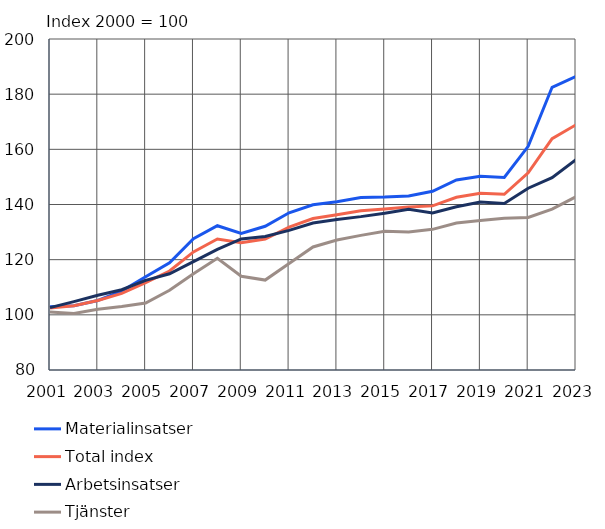
| Category | Materialinsatser | Total index | Arbetsinsatser | Tjänster |
|---|---|---|---|---|
| 2001.0 | 102.9 | 102.5 | 102.6 | 101 |
| 2002.0 | 103.3 | 103.3 | 104.8 | 100.5 |
| 2003.0 | 105.2 | 105.2 | 107.1 | 102 |
| 2004.0 | 108.6 | 107.8 | 109.1 | 103 |
| 2005.0 | 113.8 | 111.7 | 112.5 | 104.3 |
| 2006.0 | 118.9 | 115.9 | 114.9 | 108.9 |
| 2007.0 | 127.6 | 122.8 | 119.3 | 114.9 |
| 2008.0 | 132.3 | 127.5 | 123.7 | 120.5 |
| 2009.0 | 129.5 | 126.1 | 127.5 | 114 |
| 2010.0 | 132.1 | 127.5 | 128.4 | 112.6 |
| 2011.0 | 137 | 131.8 | 130.6 | 118.6 |
| 2012.0 | 139.9 | 134.9 | 133.3 | 124.6 |
| 2013.0 | 141 | 136.3 | 134.6 | 127.1 |
| 2014.0 | 142.5 | 137.7 | 135.6 | 128.8 |
| 2015.0 | 142.7 | 138.4 | 136.8 | 130.3 |
| 2016.0 | 143.1 | 139.1 | 138.3 | 130 |
| 2017.0 | 144.8 | 139.5 | 136.9 | 131 |
| 2018.0 | 148.9 | 142.6 | 139.2 | 133.3 |
| 2019.0 | 150.2 | 144.1 | 140.9 | 134.2 |
| 2020.0 | 149.8 | 143.7 | 140.4 | 135 |
| 2021.0 | 161.1 | 151.5 | 145.9 | 135.3 |
| 2022.0 | 182.5 | 163.9 | 149.7 | 138.3 |
| 2023.0 | 186.4 | 168.9 | 156.3 | 142.8 |